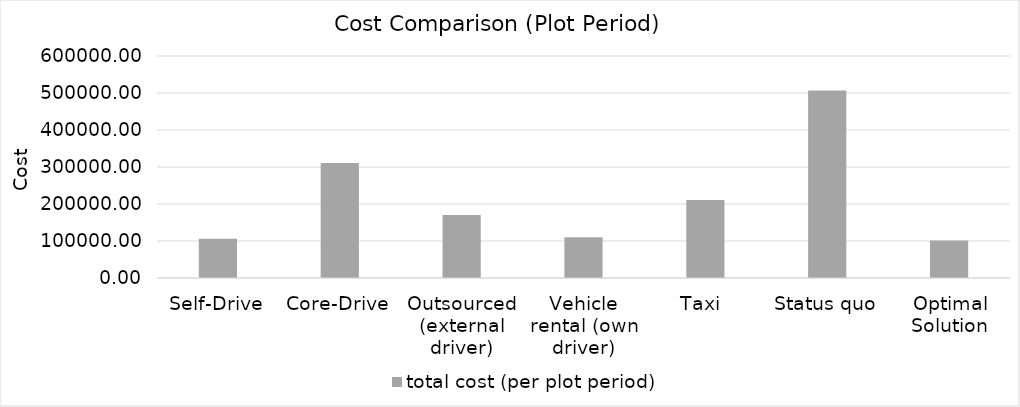
| Category | total cost (per plot period) |
|---|---|
| Self-Drive | 105961.721 |
| Core-Drive | 310480.463 |
| Outsourced (external driver) | 170000 |
| Vehicle rental (own driver) | 109837.5 |
| Taxi  | 210630 |
| Status quo | 506499.8 |
| Optimal Solution | 101172.946 |